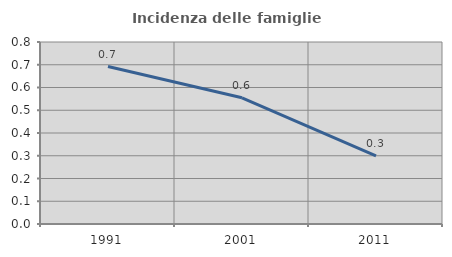
| Category | Incidenza delle famiglie numerose |
|---|---|
| 1991.0 | 0.692 |
| 2001.0 | 0.555 |
| 2011.0 | 0.299 |